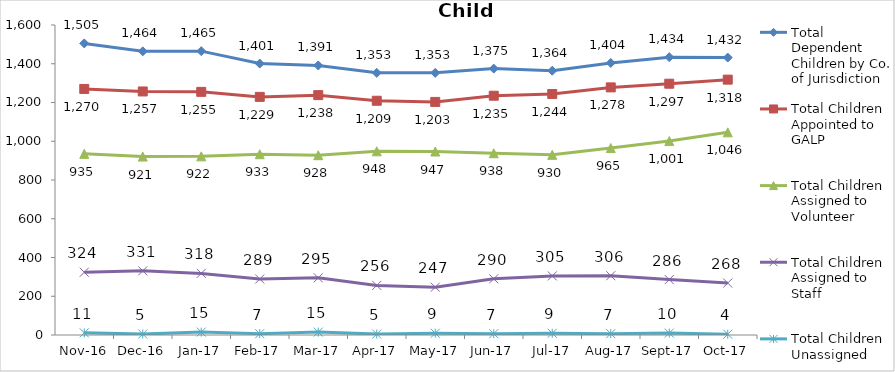
| Category | Total Dependent Children by Co. of Jurisdiction | Total Children Appointed to GALP | Total Children Assigned to Volunteer | Total Children Assigned to Staff | Total Children Unassigned |
|---|---|---|---|---|---|
| 2016-11-01 | 1505 | 1270 | 935 | 324 | 11 |
| 2016-12-01 | 1464 | 1257 | 921 | 331 | 5 |
| 2017-01-01 | 1465 | 1255 | 922 | 318 | 15 |
| 2017-02-01 | 1401 | 1229 | 933 | 289 | 7 |
| 2017-03-01 | 1391 | 1238 | 928 | 295 | 15 |
| 2017-04-01 | 1353 | 1209 | 948 | 256 | 5 |
| 2017-05-01 | 1353 | 1203 | 947 | 247 | 9 |
| 2017-06-01 | 1375 | 1235 | 938 | 290 | 7 |
| 2017-07-01 | 1364 | 1244 | 930 | 305 | 9 |
| 2017-08-01 | 1404 | 1278 | 965 | 306 | 7 |
| 2017-09-01 | 1434 | 1297 | 1001 | 286 | 10 |
| 2017-10-01 | 1432 | 1318 | 1046 | 268 | 4 |